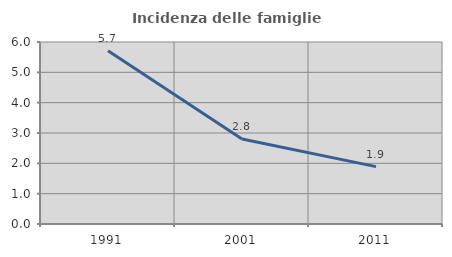
| Category | Incidenza delle famiglie numerose |
|---|---|
| 1991.0 | 5.71 |
| 2001.0 | 2.804 |
| 2011.0 | 1.891 |